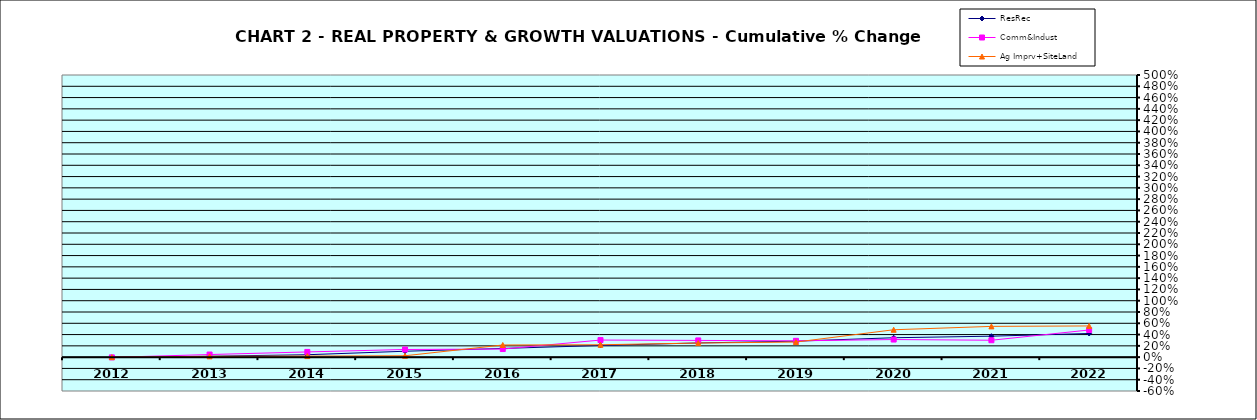
| Category | ResRec | Comm&Indust | Ag Imprv+SiteLand |
|---|---|---|---|
| 2012.0 | -0.005 | -0.004 | 0 |
| 2013.0 | 0.016 | 0.046 | 0.014 |
| 2014.0 | 0.043 | 0.092 | 0.019 |
| 2015.0 | 0.105 | 0.135 | 0.025 |
| 2016.0 | 0.154 | 0.144 | 0.215 |
| 2017.0 | 0.207 | 0.303 | 0.22 |
| 2018.0 | 0.252 | 0.296 | 0.25 |
| 2019.0 | 0.283 | 0.289 | 0.268 |
| 2020.0 | 0.344 | 0.312 | 0.485 |
| 2021.0 | 0.371 | 0.3 | 0.545 |
| 2022.0 | 0.419 | 0.481 | 0.553 |